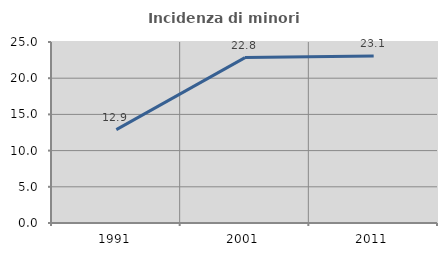
| Category | Incidenza di minori stranieri |
|---|---|
| 1991.0 | 12.895 |
| 2001.0 | 22.846 |
| 2011.0 | 23.052 |